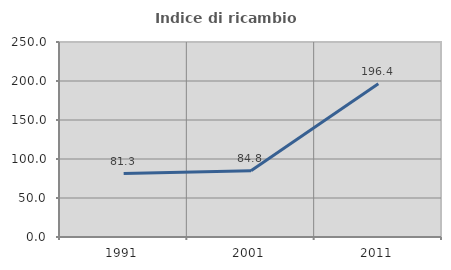
| Category | Indice di ricambio occupazionale  |
|---|---|
| 1991.0 | 81.308 |
| 2001.0 | 84.81 |
| 2011.0 | 196.364 |